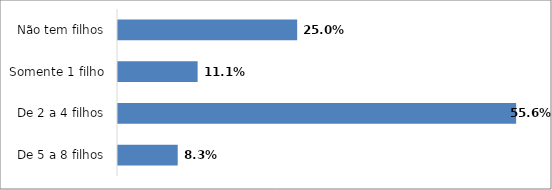
| Category | Series 0 |
|---|---|
| De 5 a 8 filhos | 0.083 |
| De 2 a 4 filhos | 0.556 |
| Somente 1 filho | 0.111 |
| Não tem filhos | 0.25 |